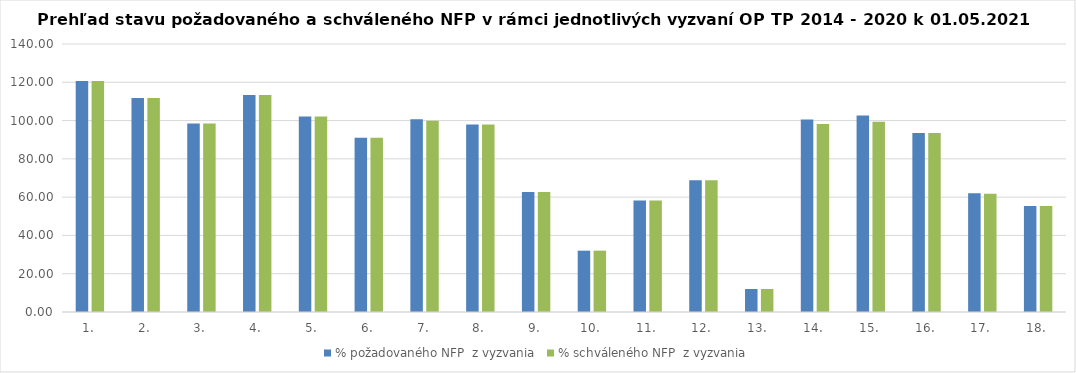
| Category | % požadovaného NFP  z vyzvania | % schváleného NFP  z vyzvania |
|---|---|---|
| 1. | 120.662 | 120.662 |
| 2. | 111.83 | 111.83 |
| 3. | 98.465 | 98.465 |
| 4. | 113.295 | 113.295 |
| 5. | 102.19 | 102.19 |
| 6. | 91.016 | 91.016 |
| 7. | 100.637 | 99.954 |
| 8. | 97.989 | 97.989 |
| 9. | 62.721 | 62.721 |
| 10. | 32.038 | 32.038 |
| 11. | 58.283 | 58.283 |
| 12. | 68.88 | 68.88 |
| 13. | 12.008 | 12.008 |
| 14. | 100.53 | 98.273 |
| 15. | 102.693 | 99.394 |
| 16. | 93.51 | 93.51 |
| 17. | 61.969 | 61.754 |
| 18. | 55.313 | 55.313 |